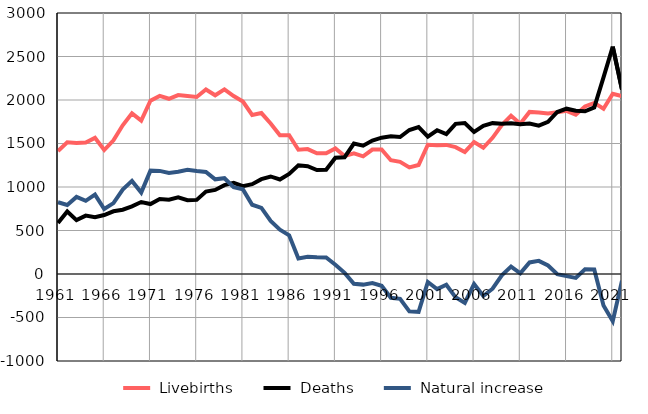
| Category |  Livebirths |  Deaths |  Natural increase |
|---|---|---|---|
| 1961.0 | 1412 | 587 | 825 |
| 1962.0 | 1513 | 719 | 794 |
| 1963.0 | 1505 | 619 | 886 |
| 1964.0 | 1512 | 671 | 841 |
| 1965.0 | 1565 | 652 | 913 |
| 1966.0 | 1425 | 678 | 747 |
| 1967.0 | 1536 | 721 | 815 |
| 1968.0 | 1709 | 739 | 970 |
| 1969.0 | 1847 | 777 | 1070 |
| 1970.0 | 1763 | 827 | 936 |
| 1971.0 | 1992 | 804 | 1188 |
| 1972.0 | 2047 | 862 | 1185 |
| 1973.0 | 2014 | 853 | 1161 |
| 1974.0 | 2056 | 881 | 1175 |
| 1975.0 | 2046 | 848 | 1198 |
| 1976.0 | 2035 | 852 | 1183 |
| 1977.0 | 2120 | 947 | 1173 |
| 1978.0 | 2054 | 966 | 1088 |
| 1979.0 | 2122 | 1021 | 1101 |
| 1980.0 | 2045 | 1048 | 997 |
| 1981.0 | 1982 | 1009 | 973 |
| 1982.0 | 1828 | 1032 | 796 |
| 1983.0 | 1850 | 1090 | 760 |
| 1984.0 | 1730 | 1121 | 609 |
| 1985.0 | 1595 | 1086 | 509 |
| 1986.0 | 1596 | 1151 | 445 |
| 1987.0 | 1428 | 1250 | 178 |
| 1988.0 | 1436 | 1239 | 197 |
| 1989.0 | 1387 | 1195 | 192 |
| 1990.0 | 1389 | 1198 | 191 |
| 1991.0 | 1444 | 1337 | 107 |
| 1992.0 | 1355 | 1342 | 13 |
| 1993.0 | 1386 | 1499 | -113 |
| 1994.0 | 1353 | 1475 | -122 |
| 1995.0 | 1430 | 1534 | -104 |
| 1996.0 | 1431 | 1567 | -136 |
| 1997.0 | 1308 | 1582 | -274 |
| 1998.0 | 1289 | 1574 | -285 |
| 1999.0 | 1225 | 1655 | -430 |
| 2000.0 | 1253 | 1688 | -435 |
| 2001.0 | 1486 | 1578 | -92 |
| 2002.0 | 1479 | 1652 | -173 |
| 2003.0 | 1484 | 1607 | -123 |
| 2004.0 | 1458 | 1726 | -268 |
| 2005.0 | 1403 | 1736 | -333 |
| 2006.0 | 1516 | 1632 | -116 |
| 2007.0 | 1451 | 1704 | -253 |
| 2008.0 | 1565 | 1734 | -169 |
| 2009.0 | 1711 | 1726 | -15 |
| 2010.0 | 1818 | 1733 | 85 |
| 2011.0 | 1728 | 1720 | 8 |
| 2012.0 | 1863 | 1730 | 133 |
| 2013.0 | 1857 | 1706 | 151 |
| 2014.0 | 1846 | 1748 | 98 |
| 2015.0 | 1860 | 1862 | -2 |
| 2016.0 | 1876 | 1900 | -24 |
| 2017.0 | 1831 | 1876 | -45 |
| 2018.0 | 1926 | 1871 | 55 |
| 2019.0 | 1967 | 1915 | 52 |
| 2020.0 | 1899 | 2261 | -362 |
| 2021.0 | 2071 | 2614 | -543 |
| 2022.0 | 2045 | 2121 | -76 |